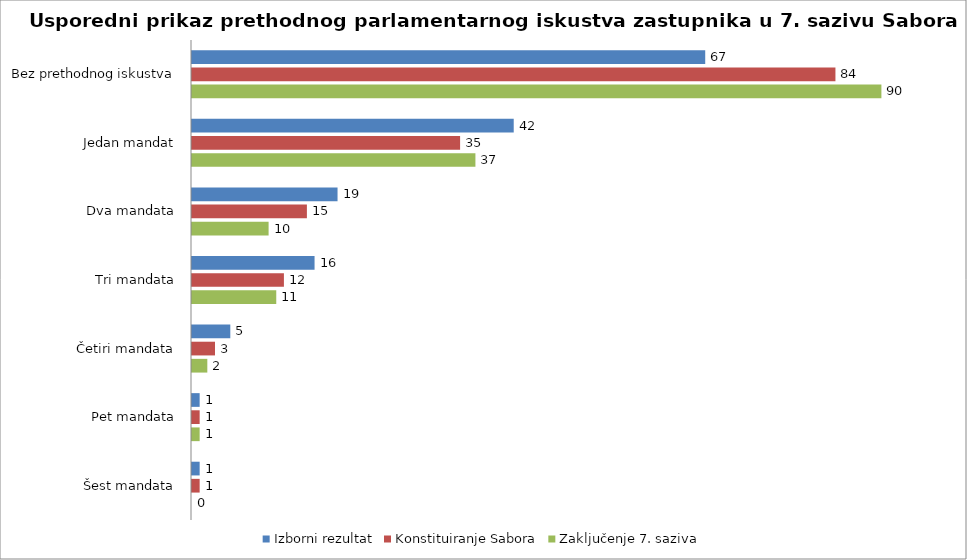
| Category | Izborni rezultat | Konstituiranje Sabora | Zaključenje 7. saziva |
|---|---|---|---|
| Bez prethodnog iskustva | 67 | 84 | 90 |
| Jedan mandat | 42 | 35 | 37 |
| Dva mandata | 19 | 15 | 10 |
| Tri mandata | 16 | 12 | 11 |
| Četiri mandata | 5 | 3 | 2 |
| Pet mandata | 1 | 1 | 1 |
| Šest mandata | 1 | 1 | 0 |